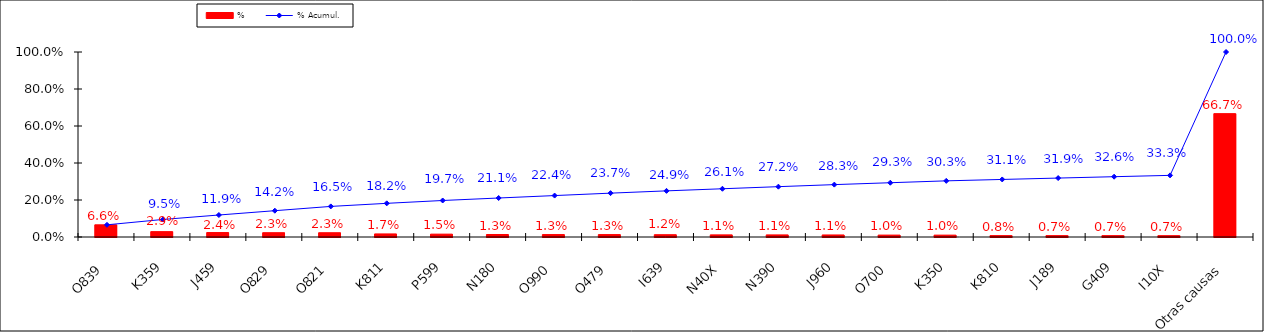
| Category | % |
|---|---|
| O839 | 0.066 |
| K359 | 0.029 |
| J459 | 0.024 |
| O829 | 0.023 |
| O821 | 0.023 |
| K811 | 0.017 |
| P599 | 0.015 |
| N180 | 0.013 |
| O990 | 0.013 |
| O479 | 0.013 |
| I639 | 0.012 |
| N40X | 0.011 |
| N390 | 0.011 |
| J960 | 0.011 |
| O700 | 0.01 |
| K350 | 0.01 |
| K810 | 0.008 |
| J189 | 0.007 |
| G409 | 0.007 |
| I10X | 0.007 |
| Otras causas | 0.667 |